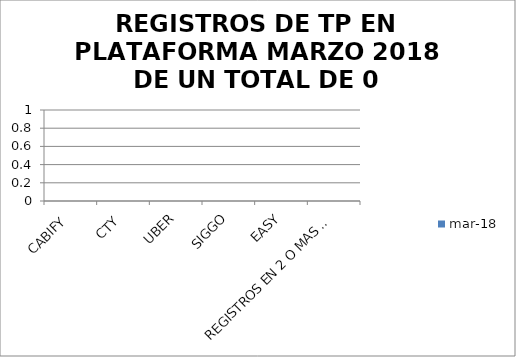
| Category | mar-18 |
|---|---|
| CABIFY | 0 |
| CTY | 0 |
| UBER | 0 |
| SIGGO | 0 |
| EASY | 0 |
| REGISTROS EN 2 O MAS PLATAFORMAS | 0 |